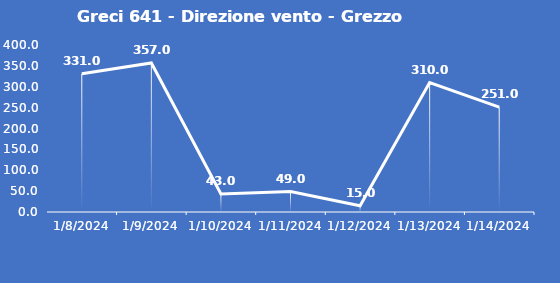
| Category | Greci 641 - Direzione vento - Grezzo (°N) |
|---|---|
| 1/8/24 | 331 |
| 1/9/24 | 357 |
| 1/10/24 | 43 |
| 1/11/24 | 49 |
| 1/12/24 | 15 |
| 1/13/24 | 310 |
| 1/14/24 | 251 |